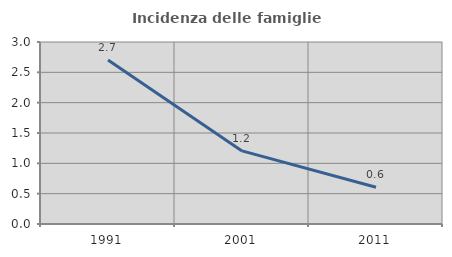
| Category | Incidenza delle famiglie numerose |
|---|---|
| 1991.0 | 2.703 |
| 2001.0 | 1.205 |
| 2011.0 | 0.606 |